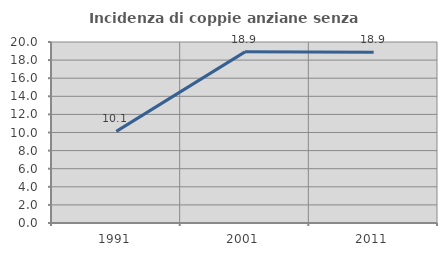
| Category | Incidenza di coppie anziane senza figli  |
|---|---|
| 1991.0 | 10.123 |
| 2001.0 | 18.91 |
| 2011.0 | 18.876 |